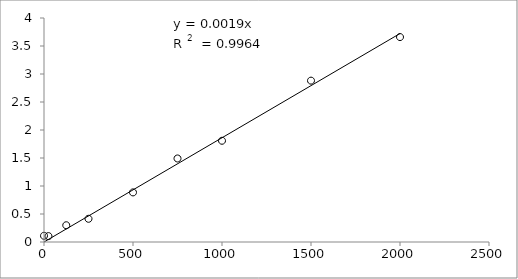
| Category | Series 0 |
|---|---|
| 2000.0 | 3.66 |
| 1500.0 | 2.882 |
| 1000.0 | 1.808 |
| 750.0 | 1.491 |
| 500.0 | 0.886 |
| 250.0 | 0.414 |
| 125.0 | 0.299 |
| 25.0 | 0.105 |
| 0.0 | 0.111 |